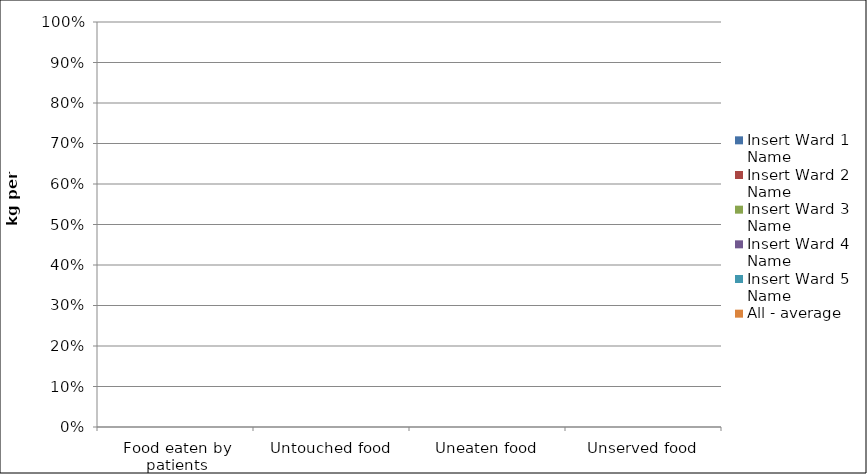
| Category | Insert Ward 1 Name | Insert Ward 2 Name | Insert Ward 3 Name | Insert Ward 4 Name | Insert Ward 5 Name | All - average |
|---|---|---|---|---|---|---|
| Food eaten by patients | 0 | 0 | 0 | 0 | 0 | 0 |
| Untouched food | 0 | 0 | 0 | 0 | 0 | 0 |
| Uneaten food | 0 | 0 | 0 | 0 | 0 | 0 |
| Unserved food | 0 | 0 | 0 | 0 | 0 | 0 |